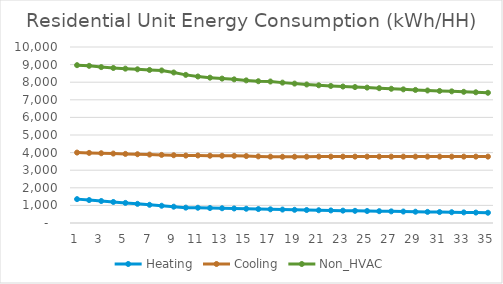
| Category | Heating | Cooling | Non_HVAC |
|---|---|---|---|
| 0 | 1356.368 | 4001.613 | 8967.818 |
| 1 | 1302.651 | 3982.742 | 8930.082 |
| 2 | 1248.933 | 3963.871 | 8857.514 |
| 3 | 1195.216 | 3945.001 | 8808.726 |
| 4 | 1141.499 | 3926.13 | 8769.734 |
| 5 | 1087.782 | 3907.259 | 8732.467 |
| 6 | 1034.065 | 3888.388 | 8695.295 |
| 7 | 980.347 | 3869.518 | 8668.147 |
| 8 | 926.63 | 3850.647 | 8551.35 |
| 9 | 872.913 | 3831.776 | 8416.117 |
| 10 | 866.956 | 3836.489 | 8323.39 |
| 11 | 851.344 | 3822.427 | 8257.751 |
| 12 | 838.22 | 3819.147 | 8204.899 |
| 13 | 825.313 | 3815.812 | 8161.372 |
| 14 | 809.587 | 3802.505 | 8102.954 |
| 15 | 792.294 | 3783.754 | 8054.934 |
| 16 | 777.192 | 3769.266 | 8039.511 |
| 17 | 763.074 | 3764.154 | 7975.837 |
| 18 | 750.047 | 3764.545 | 7920.849 |
| 19 | 737.505 | 3766.704 | 7870.445 |
| 20 | 724.661 | 3771.407 | 7824.754 |
| 21 | 712.519 | 3771.407 | 7786.614 |
| 22 | 701.651 | 3771.407 | 7753.884 |
| 23 | 691.363 | 3771.407 | 7723.312 |
| 24 | 681.248 | 3771.407 | 7692.441 |
| 25 | 671.502 | 3771.407 | 7659.975 |
| 26 | 660.976 | 3771.407 | 7626.836 |
| 27 | 650.928 | 3771.407 | 7593.412 |
| 28 | 641.049 | 3771.407 | 7560.418 |
| 29 | 630.935 | 3771.407 | 7529.363 |
| 30 | 621.618 | 3771.407 | 7503.259 |
| 31 | 612.453 | 3771.407 | 7479.277 |
| 32 | 602.518 | 3771.407 | 7453.655 |
| 33 | 592.794 | 3771.407 | 7426.395 |
| 34 | 583.1 | 3771.407 | 7399.056 |